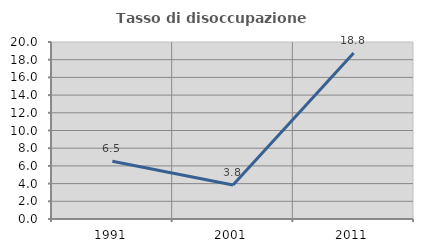
| Category | Tasso di disoccupazione giovanile  |
|---|---|
| 1991.0 | 6.522 |
| 2001.0 | 3.846 |
| 2011.0 | 18.75 |